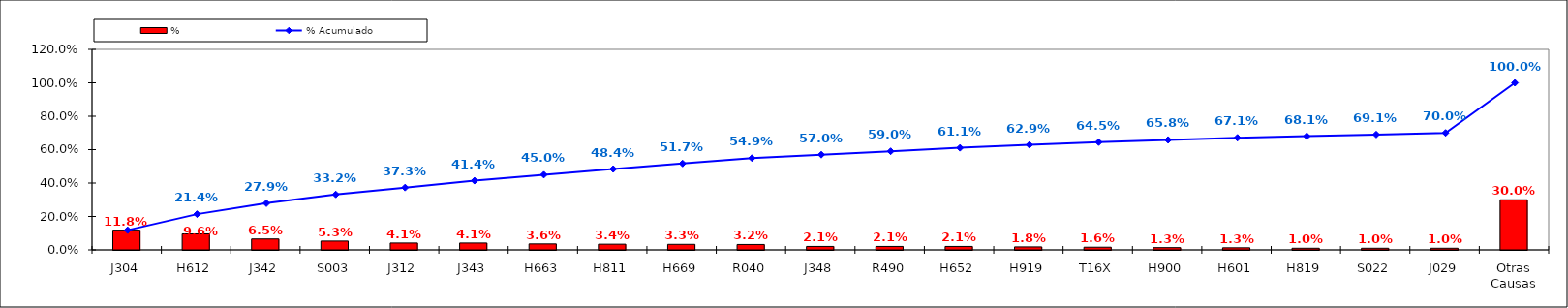
| Category | % |
|---|---|
| J304 | 0.118 |
| H612 | 0.096 |
| J342 | 0.065 |
| S003 | 0.053 |
| J312 | 0.041 |
| J343 | 0.041 |
| H663 | 0.036 |
| H811 | 0.034 |
| H669 | 0.033 |
| R040 | 0.032 |
| J348 | 0.021 |
| R490 | 0.021 |
| H652 | 0.021 |
| H919 | 0.018 |
| T16X | 0.016 |
| H900 | 0.013 |
| H601 | 0.013 |
| H819 | 0.01 |
| S022 | 0.01 |
| J029 | 0.01 |
| Otras Causas | 0.3 |